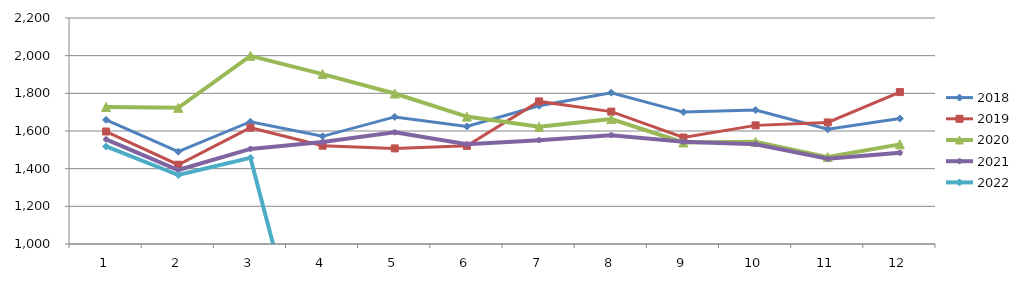
| Category | 2018 | 2019 | 2020 | 2021 | 2022 |
|---|---|---|---|---|---|
| 0 | 1659.233 | 1597.182 | 1727.767 | 1555.724 | 1517.795 |
| 1 | 1490.116 | 1420.981 | 1722.949 | 1392.893 | 1366.356 |
| 2 | 1649.429 | 1617.601 | 1999.15 | 1504.855 | 1457.257 |
| 3 | 1571.732 | 1521.999 | 1902.268 | 1541.039 | 0 |
| 4 | 1674.727 | 1507.654 | 1798.925 | 1592.865 | 0 |
| 5 | 1624.201 | 1521.033 | 1676.477 | 1529.566 | 0 |
| 6 | 1733.621 | 1757.049 | 1622.712 | 1551.412 | 0 |
| 7 | 1803.444 | 1702.894 | 1663.262 | 1577.956 | 0 |
| 8 | 1700.265 | 1565.361 | 1539.017 | 1542.78 | 0 |
| 9 | 1710.862 | 1629.894 | 1542.307 | 1529.928 | 0 |
| 10 | 1609.178 | 1645.62 | 1461.483 | 1452.733 | 0 |
| 11 | 1666.129 | 1806.739 | 1529.116 | 1484.399 | 0 |